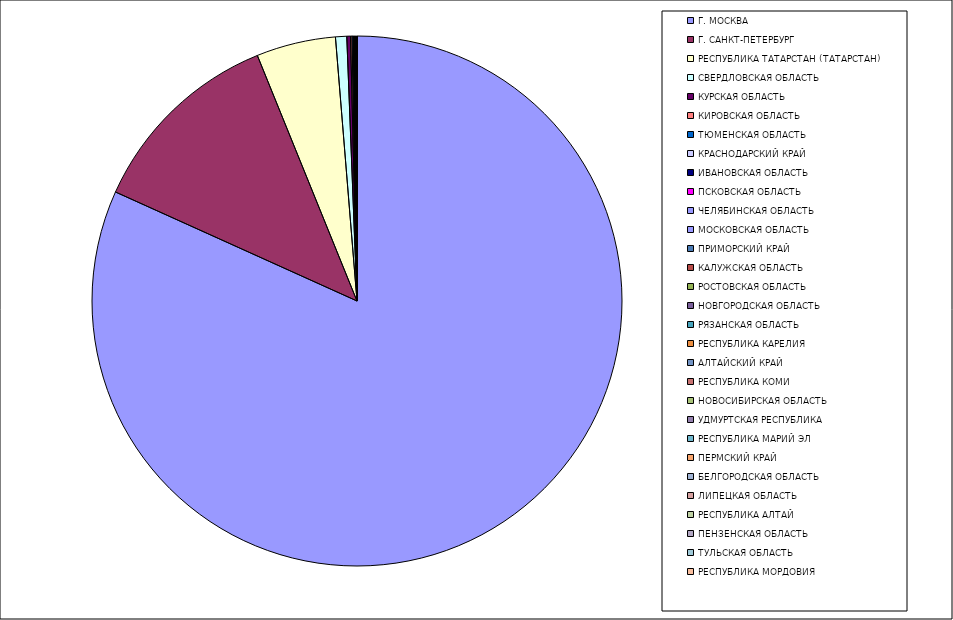
| Category | Оборот |
|---|---|
| Г. МОСКВА | 81.738 |
| Г. САНКТ-ПЕТЕРБУРГ | 12.115 |
| РЕСПУБЛИКА ТАТАРСТАН (ТАТАРСТАН) | 4.838 |
| СВЕРДЛОВСКАЯ ОБЛАСТЬ | 0.682 |
| КУРСКАЯ ОБЛАСТЬ | 0.224 |
| КИРОВСКАЯ ОБЛАСТЬ | 0.09 |
| ТЮМЕНСКАЯ ОБЛАСТЬ | 0.073 |
| КРАСНОДАРСКИЙ КРАЙ | 0.032 |
| ИВАНОВСКАЯ ОБЛАСТЬ | 0.024 |
| ПСКОВСКАЯ ОБЛАСТЬ | 0.022 |
| ЧЕЛЯБИНСКАЯ ОБЛАСТЬ | 0.021 |
| МОСКОВСКАЯ ОБЛАСТЬ | 0.017 |
| ПРИМОРСКИЙ КРАЙ | 0.016 |
| КАЛУЖСКАЯ ОБЛАСТЬ | 0.012 |
| РОСТОВСКАЯ ОБЛАСТЬ | 0.011 |
| НОВГОРОДСКАЯ ОБЛАСТЬ | 0.008 |
| РЯЗАНСКАЯ ОБЛАСТЬ | 0.007 |
| РЕСПУБЛИКА КАРЕЛИЯ | 0.007 |
| АЛТАЙСКИЙ КРАЙ | 0.007 |
| РЕСПУБЛИКА КОМИ | 0.006 |
| НОВОСИБИРСКАЯ ОБЛАСТЬ | 0.005 |
| УДМУРТСКАЯ РЕСПУБЛИКА | 0.005 |
| РЕСПУБЛИКА МАРИЙ ЭЛ | 0.005 |
| ПЕРМСКИЙ КРАЙ | 0.005 |
| БЕЛГОРОДСКАЯ ОБЛАСТЬ | 0.004 |
| ЛИПЕЦКАЯ ОБЛАСТЬ | 0.004 |
| РЕСПУБЛИКА АЛТАЙ | 0.003 |
| ПЕНЗЕНСКАЯ ОБЛАСТЬ | 0.003 |
| ТУЛЬСКАЯ ОБЛАСТЬ | 0.002 |
| РЕСПУБЛИКА МОРДОВИЯ | 0.002 |